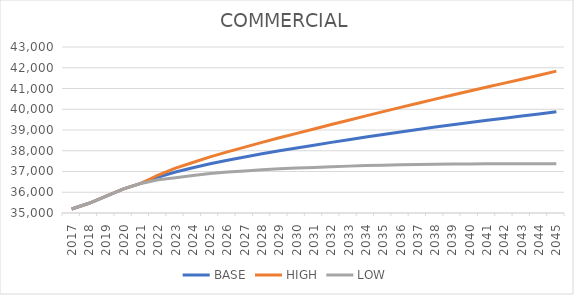
| Category | BASE | HIGH | LOW |
|---|---|---|---|
| 2017.0 | 35193.25 | 35193.25 | 35193.25 |
| 2018.0 | 35468.015 | 35468.015 | 35468.015 |
| 2019.0 | 35811.917 | 35811.917 | 35811.917 |
| 2020.0 | 36162.083 | 36162.083 | 36162.083 |
| 2021.0 | 36425.417 | 36425.417 | 36425.417 |
| 2022.0 | 36737.839 | 36830.704 | 36599.628 |
| 2023.0 | 36973.391 | 37161.356 | 36697.384 |
| 2024.0 | 37176.809 | 37435.045 | 36803.682 |
| 2025.0 | 37374.164 | 37704.13 | 36902.735 |
| 2026.0 | 37542.949 | 37945.54 | 36972.803 |
| 2027.0 | 37697 | 38173.175 | 37027.662 |
| 2028.0 | 37852.583 | 38403.596 | 37083.198 |
| 2029.0 | 37998.08 | 38624.792 | 37128.317 |
| 2030.0 | 38133.181 | 38836.301 | 37162.92 |
| 2031.0 | 38268.859 | 39049.494 | 37197.473 |
| 2032.0 | 38404.453 | 39263.679 | 37231.37 |
| 2033.0 | 38534.01 | 39472.595 | 37259.058 |
| 2034.0 | 38661.217 | 39680.054 | 37284.076 |
| 2035.0 | 38786.033 | 39886.039 | 37306.378 |
| 2036.0 | 38907.919 | 40089.925 | 37325.519 |
| 2037.0 | 39026.022 | 40290.75 | 37340.795 |
| 2038.0 | 39140.323 | 40488.476 | 37352.237 |
| 2039.0 | 39252.646 | 40685.011 | 37361.55 |
| 2040.0 | 39360.958 | 40878.107 | 37366.961 |
| 2041.0 | 39465.825 | 41068.374 | 37369.028 |
| 2042.0 | 39569.421 | 41258.159 | 37369.673 |
| 2043.0 | 39672.941 | 41448.722 | 37370.018 |
| 2044.0 | 39774.747 | 41638.294 | 37368.654 |
| 2045.0 | 39883.845 | 41837.035 | 37373.172 |